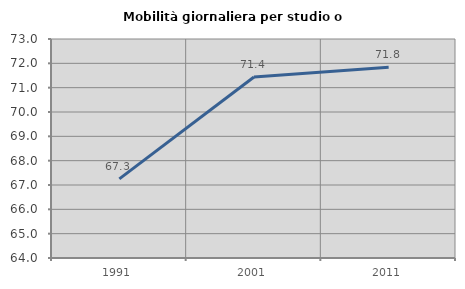
| Category | Mobilità giornaliera per studio o lavoro |
|---|---|
| 1991.0 | 67.25 |
| 2001.0 | 71.437 |
| 2011.0 | 71.838 |